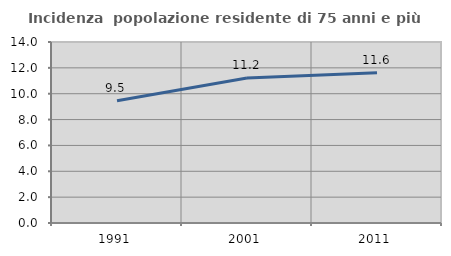
| Category | Incidenza  popolazione residente di 75 anni e più |
|---|---|
| 1991.0 | 9.461 |
| 2001.0 | 11.219 |
| 2011.0 | 11.627 |